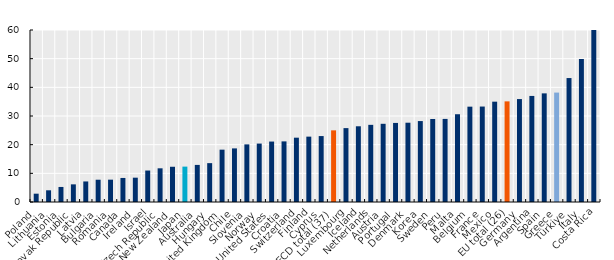
| Category | Series 0 |
|---|---|
| Poland | 2.901 |
| Lithuania | 4.082 |
| Estonia | 5.246 |
| Slovak Republic | 6.157 |
| Latvia | 7.169 |
| Bulgaria | 7.772 |
| Romania | 7.793 |
| Canada | 8.388 |
| Ireland | 8.483 |
| Israel | 10.978 |
| Czech Republic | 11.753 |
| New Zealand | 12.292 |
| Japan | 12.343 |
| Australia | 12.937 |
| Hungary | 13.557 |
| United Kingdom | 18.258 |
| Chile | 18.7 |
| Slovenia | 20.102 |
| Norway | 20.38 |
| United States | 21.086 |
| Croatia | 21.146 |
| Switzerland | 22.436 |
| Finland | 22.804 |
| Cyprus | 23.001 |
| OECD total (37) | 24.994 |
| Luxembourg | 25.775 |
| Iceland | 26.414 |
| Netherlands | 26.916 |
| Austria | 27.28 |
| Portugal | 27.583 |
| Denmark | 27.659 |
| Korea | 28.233 |
| Sweden | 28.951 |
| Peru | 28.983 |
| Malta | 30.618 |
| Belgium | 33.258 |
| France | 33.299 |
| Mexico | 35 |
| EU total (26) | 35.105 |
| Germany | 35.908 |
| Argentina | 37 |
| Spain | 37.896 |
| Greece | 38.169 |
| Türkiye | 43.237 |
| Italy | 49.895 |
| Costa Rica | 68.7 |